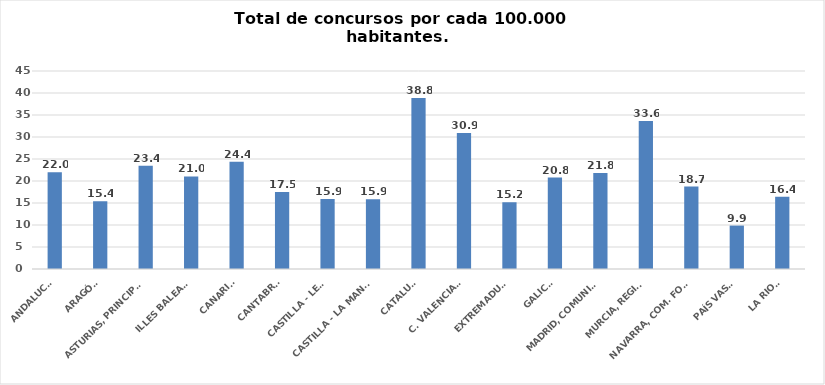
| Category | Series 0 |
|---|---|
| ANDALUCÍA | 22.012 |
| ARAGÓN | 15.415 |
| ASTURIAS, PRINCIPADO | 23.445 |
| ILLES BALEARS | 21.049 |
| CANARIAS | 24.357 |
| CANTABRIA | 17.501 |
| CASTILLA - LEÓN | 15.907 |
| CASTILLA - LA MANCHA | 15.861 |
| CATALUÑA | 38.84 |
| C. VALENCIANA | 30.891 |
| EXTREMADURA | 15.176 |
| GALICIA | 20.78 |
| MADRID, COMUNIDAD | 21.843 |
| MURCIA, REGIÓN | 33.619 |
| NAVARRA, COM. FORAL | 18.744 |
| PAÍS VASCO | 9.865 |
| LA RIOJA | 16.446 |